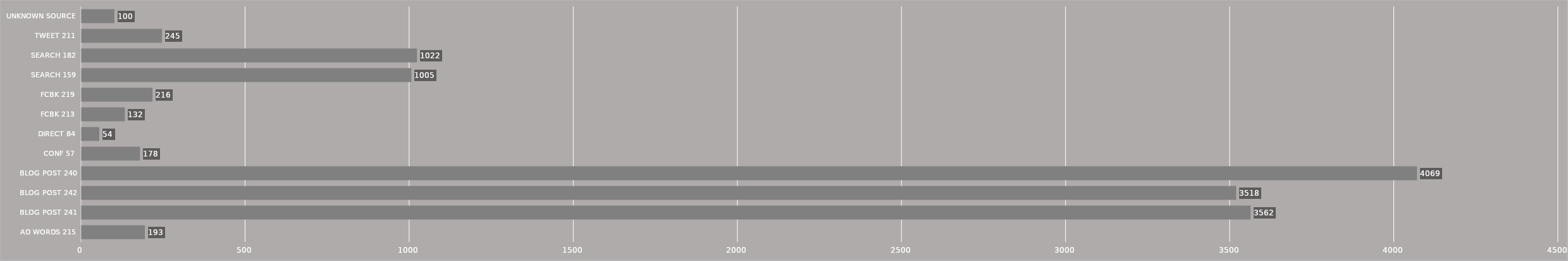
| Category | Series 0 |
|---|---|
| AD WORDS 215 | 193 |
| BLOG POST 241 | 3562 |
| BLOG POST 242 | 3518 |
| BLOG POST 240 | 4069 |
| CONF 57 | 178 |
| DIRECT 84 | 54 |
| FCBK 213 | 132 |
| FCBK 219 | 216 |
| SEARCH 159 | 1005 |
| SEARCH 182 | 1022 |
| TWEET 211 | 245 |
| UNKNOWN SOURCE | 100 |